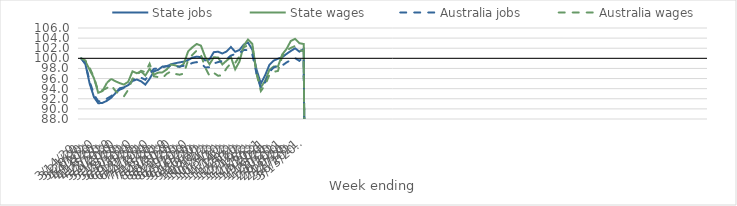
| Category | State jobs | State wages | Australia jobs | Australia wages |
|---|---|---|---|---|
| 14/03/2020 | 100 | 100 | 100 | 100 |
| 21/03/2020 | 98.832 | 99.393 | 98.956 | 99.571 |
| 28/03/2020 | 94.966 | 97.723 | 95.411 | 98.095 |
| 04/04/2020 | 92.326 | 96.061 | 92.814 | 96.217 |
| 11/04/2020 | 91.11 | 93.183 | 91.522 | 93.51 |
| 18/04/2020 | 91.186 | 93.526 | 91.499 | 93.706 |
| 25/04/2020 | 91.599 | 95.131 | 92.024 | 94.115 |
| 02/05/2020 | 92.192 | 95.935 | 92.518 | 94.669 |
| 09/05/2020 | 93.088 | 95.474 | 93.198 | 93.587 |
| 16/05/2020 | 94.073 | 95.102 | 93.789 | 92.821 |
| 23/05/2020 | 94.262 | 94.809 | 94.145 | 92.476 |
| 30/05/2020 | 94.692 | 95.357 | 94.654 | 93.783 |
| 06/06/2020 | 95.509 | 97.43 | 95.642 | 95.969 |
| 13/06/2020 | 95.816 | 97.057 | 96.146 | 96.63 |
| 20/06/2020 | 95.46 | 97.408 | 96.166 | 97.54 |
| 27/06/2020 | 94.801 | 96.603 | 95.757 | 97.254 |
| 04/07/2020 | 95.943 | 97.926 | 96.891 | 98.931 |
| 11/07/2020 | 97.422 | 96.787 | 97.918 | 96.452 |
| 18/07/2020 | 97.731 | 97.167 | 98.015 | 96.287 |
| 25/07/2020 | 98.375 | 97.221 | 98.234 | 96.104 |
| 01/08/2020 | 98.436 | 97.802 | 98.45 | 96.943 |
| 08/08/2020 | 98.818 | 98.767 | 98.442 | 97.412 |
| 15/08/2020 | 99.034 | 98.612 | 98.335 | 96.914 |
| 22/08/2020 | 99.2 | 98.272 | 98.39 | 96.757 |
| 29/08/2020 | 99.345 | 98.949 | 98.521 | 96.978 |
| 05/09/2020 | 99.675 | 101.371 | 98.687 | 99.677 |
| 12/09/2020 | 100.138 | 102.189 | 99.091 | 100.68 |
| 19/09/2020 | 100.336 | 102.841 | 99.254 | 101.536 |
| 26/09/2020 | 100.233 | 102.506 | 99.049 | 100.689 |
| 03/10/2020 | 99.597 | 100.249 | 98.196 | 98.175 |
| 10/10/2020 | 99.779 | 98.832 | 98.237 | 96.534 |
| 17/10/2020 | 101.216 | 100.206 | 98.99 | 97.113 |
| 24/10/2020 | 101.312 | 100.171 | 99.254 | 96.552 |
| 31/10/2020 | 100.953 | 98.799 | 99.461 | 96.668 |
| 07/11/2020 | 101.372 | 99.546 | 99.844 | 98.053 |
| 14/11/2020 | 102.238 | 100.241 | 100.553 | 99.053 |
| 21/11/2020 | 101.303 | 97.829 | 100.846 | 99.075 |
| 28/11/2020 | 101.65 | 99.353 | 101.126 | 100.407 |
| 05/12/2020 | 102.713 | 102.54 | 101.622 | 102.179 |
| 12/12/2020 | 103.112 | 103.719 | 101.647 | 102.628 |
| 19/12/2020 | 101.722 | 102.848 | 100.808 | 102.478 |
| 26/12/2020 | 97.746 | 96.986 | 96.977 | 96.957 |
| 02/01/2021 | 95.011 | 94.28 | 94.05 | 93.527 |
| 09/01/2021 | 96.645 | 95.556 | 95.274 | 94.722 |
| 16/01/2021 | 98.705 | 97.727 | 97.292 | 96.737 |
| 23/01/2021 | 99.544 | 98.372 | 98.18 | 97.336 |
| 30/01/2021 | 99.923 | 98.385 | 98.522 | 97.507 |
| 06/02/2021 | 100.22 | 100.773 | 98.581 | 100.419 |
| 13/02/2021 | 100.873 | 101.85 | 99.185 | 101.54 |
| 20/02/2021 | 101.452 | 103.435 | 99.643 | 102.046 |
| 27/02/2021 | 101.986 | 103.853 | 100.036 | 102.451 |
| 06/03/2021 | 101.325 | 102.993 | 99.503 | 101.603 |
| 13/03/2021 | 101.842 | 102.836 | 100.244 | 101.4 |